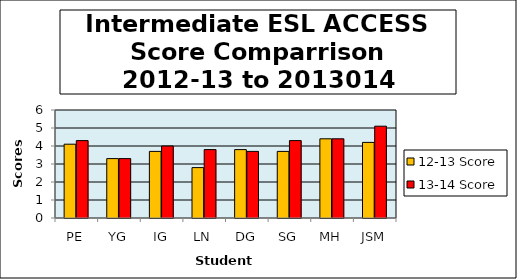
| Category | 12-13 Score | 13-14 Score |
|---|---|---|
| PE | 4.1 | 4.3 |
| YG | 3.3 | 3.3 |
| IG | 3.7 | 4 |
| LN | 2.8 | 3.8 |
| DG | 3.8 | 3.7 |
| SG | 3.7 | 4.3 |
| MH | 4.4 | 4.4 |
| JSM | 4.2 | 5.1 |